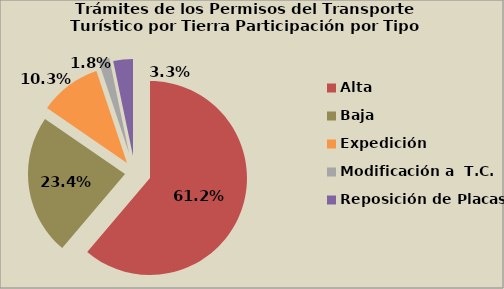
| Category | Series 0 |
|---|---|
| Alta                                         | 61.206 |
| Baja | 23.368 |
| Expedición | 10.316 |
| Modificación a  T.C. | 1.835 |
| Reposición de Placas | 3.274 |